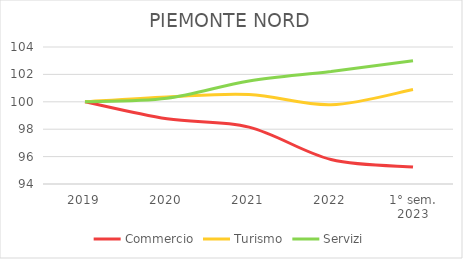
| Category | Commercio | Turismo | Servizi |
|---|---|---|---|
| 2019 | 100 | 100 | 100 |
| 2020 | 98.756 | 100.352 | 100.262 |
| 2021 | 98.152 | 100.534 | 101.523 |
| 2022 | 95.789 | 99.784 | 102.218 |
| 1° sem.
2023 | 95.247 | 100.897 | 102.998 |